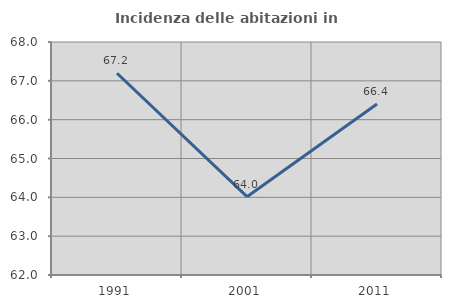
| Category | Incidenza delle abitazioni in proprietà  |
|---|---|
| 1991.0 | 67.194 |
| 2001.0 | 64.017 |
| 2011.0 | 66.406 |